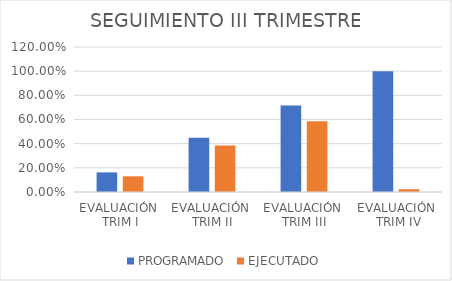
| Category | PROGRAMADO | EJECUTADO |
|---|---|---|
| EVALUACIÓN 
TRIM I | 0.162 | 0.13 |
| EVALUACIÓN 
TRIM II | 0.448 | 0.384 |
| EVALUACIÓN 
TRIM III | 0.715 | 0.585 |
| EVALUACIÓN
 TRIM IV | 1 | 0.023 |